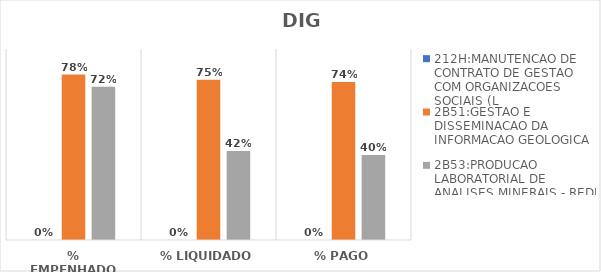
| Category | 212H:MANUTENCAO DE CONTRATO DE GESTAO COM ORGANIZACOES SOCIAIS (L | 2B51:GESTAO E DISSEMINACAO DA INFORMACAO GEOLOGICA | 2B53:PRODUCAO LABORATORIAL DE ANALISES MINERAIS - REDE LAMIN |
|---|---|---|---|
| % EMPENHADO | 0 | 0.78 | 0.723 |
| % LIQUIDADO | 0 | 0.755 | 0.42 |
| % PAGO | 0 | 0.744 | 0.4 |